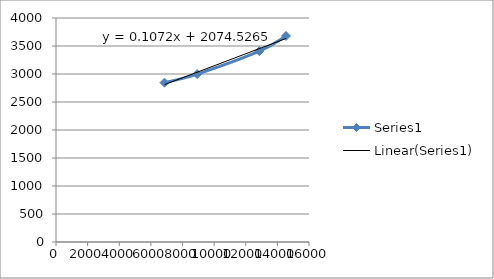
| Category | Series 0 |
|---|---|
| 6860.0 | 2845 |
| 8928.0 | 2998 |
| 12859.0 | 3408 |
| 14545.0 | 3679 |